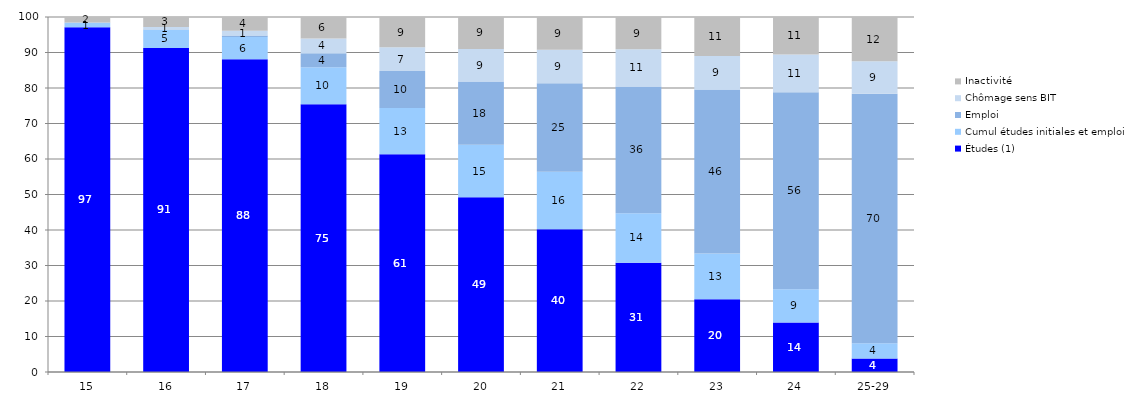
| Category | Études (1) | Cumul études initiales et emploi | Emploi | Chômage sens BIT | Inactivité  |
|---|---|---|---|---|---|
| 15 | 97.14 | 1.21 | 0.09 | 0.03 | 1.53 |
| 16 | 91.3 | 5.01 | 0.16 | 0.73 | 2.8 |
| 17 | 88.11 | 6.25 | 0.44 | 1.34 | 3.87 |
| 18 | 75.44 | 10.37 | 3.97 | 4.14 | 6.08 |
| 19 | 61.31 | 13.05 | 10.4 | 6.7 | 8.54 |
| 20 | 49.22 | 14.78 | 17.82 | 9.2 | 8.98 |
| 21 | 40.24 | 16.15 | 24.93 | 9.47 | 9.21 |
| 22 | 30.78 | 13.97 | 35.68 | 10.5 | 9.06 |
| 23 | 20.48 | 12.92 | 46.18 | 9.46 | 10.95 |
| 24 | 13.96 | 9.37 | 55.5 | 10.61 | 10.57 |
| 25-29 | 3.81 | 4.28 | 70.26 | 9.16 | 12.48 |